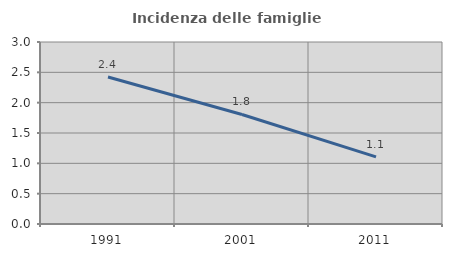
| Category | Incidenza delle famiglie numerose |
|---|---|
| 1991.0 | 2.422 |
| 2001.0 | 1.805 |
| 2011.0 | 1.107 |